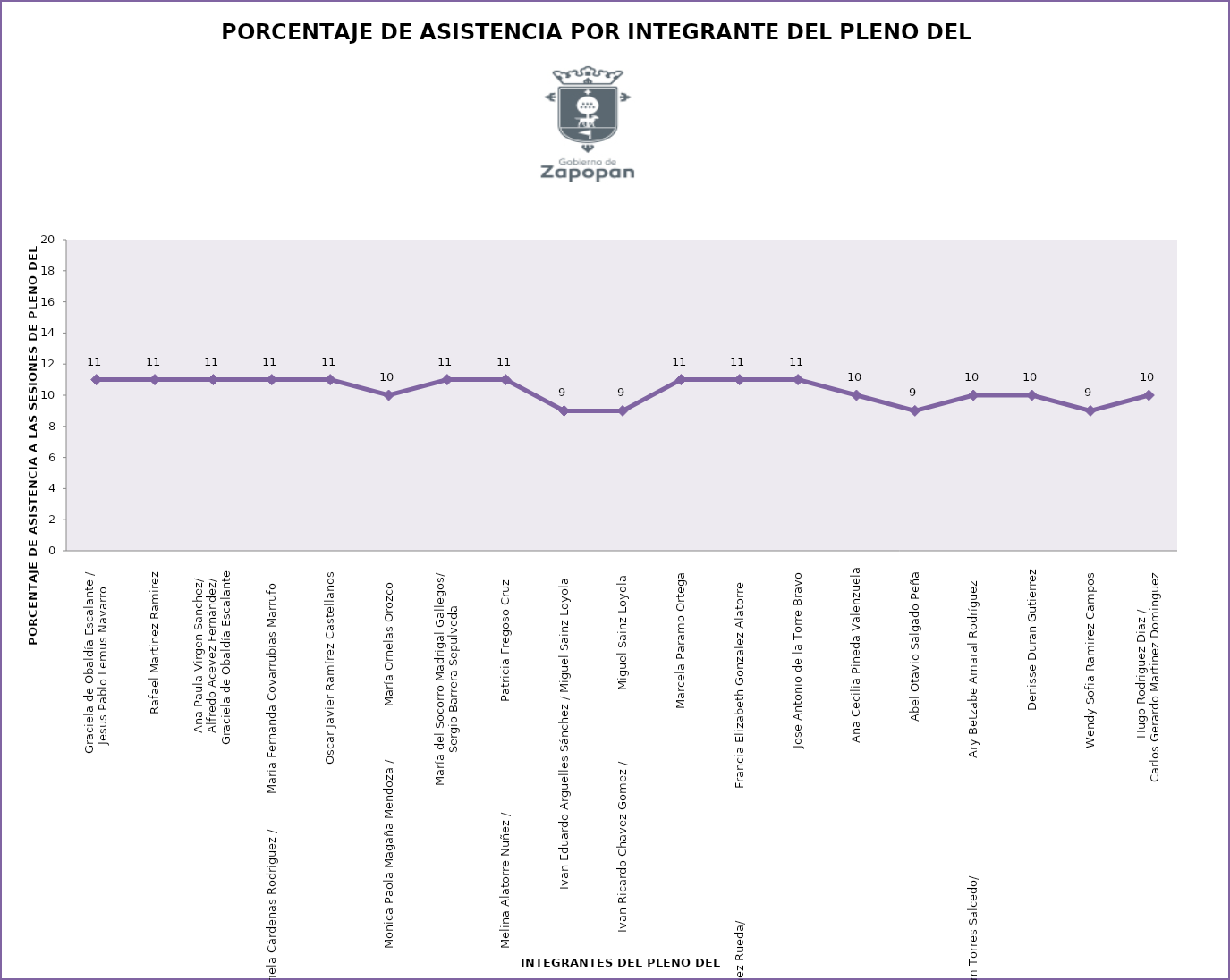
| Category | Series 0 |
|---|---|
| Graciela de Obaldía Escalante /
Jesus Pablo Lemus Navarro   | 11 |
| Rafael Martinez Ramirez  | 11 |
| Ana Paula Virgen Sanchez/
Alfredo Acevez Fernández/
Graciela de Obaldía Escalante  | 11 |
| Laura Gabriela Cárdenas Rodríguez /          María Fernanda Covarrubias Marrufo | 11 |
| Oscar Javier Ramírez Castellanos  | 11 |
| Monica Paola Magaña Mendoza /               María Ornelas Orozco  | 10 |
| María del Socorro Madrigal Gallegos/
Sergio Barrera Sepulveda | 11 |
| Melina Alatorre Nuñez /                               Patricia Fregoso Cruz | 11 |
| Ivan Eduardo Arguelles Sánchez / Miguel Sainz Loyola  | 9 |
| Ivan Ricardo Chavez Gomez /                    Miguel Sainz Loyola | 9 |
| Marcela Paramo Ortega  | 11 |
| Maria Gomez Rueda/                                     Francia Elizabeth Gonzalez Alatorre | 11 |
| Jose Antonio de la Torre Bravo  | 11 |
| Ana Cecilia Pineda Valenzuela | 10 |
| Abel Otavio Salgado Peña  | 9 |
| Jose Hiram Torres Salcedo/                                 Ary Betzabe Amaral Rodríguez | 10 |
| Denisse Duran Gutierrez | 10 |
| Wendy Sofia Ramirez Campos  | 9 |
| Hugo Rodriguez Diaz /
Carlos Gerardo Martinez Dominguez  | 10 |